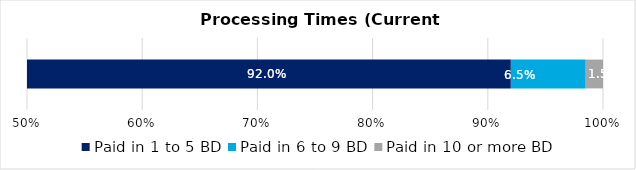
| Category | Paid in 1 to 5 BD | Paid in 6 to 9 BD | Paid in 10 or more BD |
|---|---|---|---|
| 0 | 0.92 | 0.065 | 0.015 |